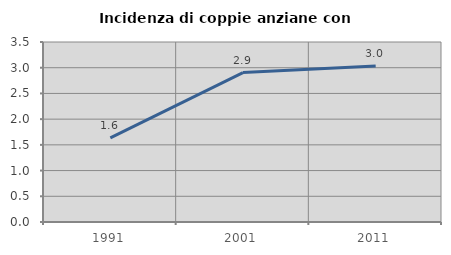
| Category | Incidenza di coppie anziane con figli |
|---|---|
| 1991.0 | 1.634 |
| 2001.0 | 2.905 |
| 2011.0 | 3.032 |